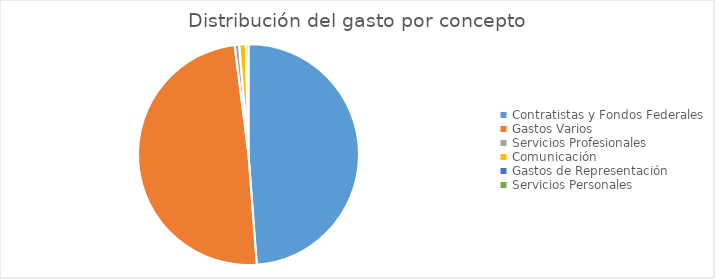
| Category | Series 0 |
|---|---|
| Contratistas y Fondos Federales | 652727525.32 |
| Gastos Varios | 657799382.38 |
| Servicios Profesionales | 8853175.43 |
| Comunicación | 12972160.43 |
| Gastos de Representación | 17482.89 |
| Servicios Personales | 5155176.2 |